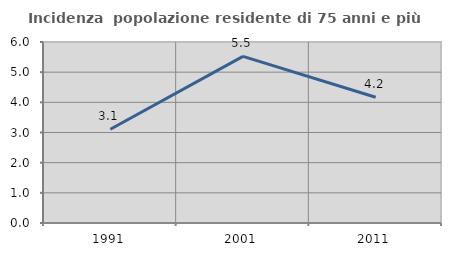
| Category | Incidenza  popolazione residente di 75 anni e più |
|---|---|
| 1991.0 | 3.109 |
| 2001.0 | 5.521 |
| 2011.0 | 4.167 |